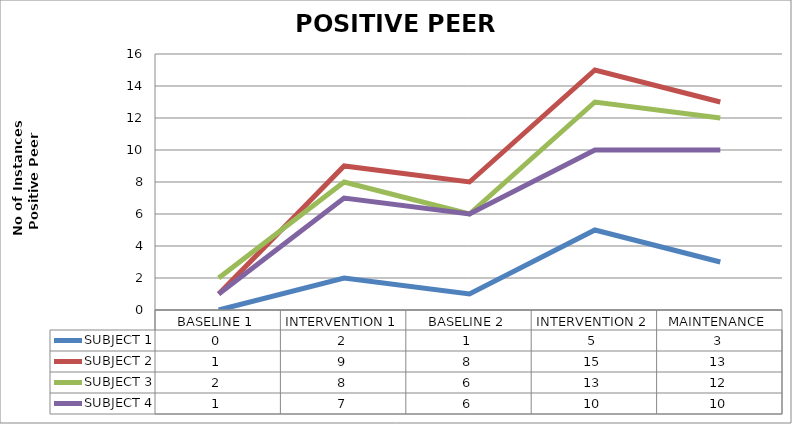
| Category | SUBJECT 1 | SUBJECT 2 | SUBJECT 3 | SUBJECT 4 |
|---|---|---|---|---|
| BASELINE 1 | 0 | 1 | 2 | 1 |
| INTERVENTION 1 | 2 | 9 | 8 | 7 |
| BASELINE 2 | 1 | 8 | 6 | 6 |
| INTERVENTION 2 | 5 | 15 | 13 | 10 |
| MAINTENANCE | 3 | 13 | 12 | 10 |